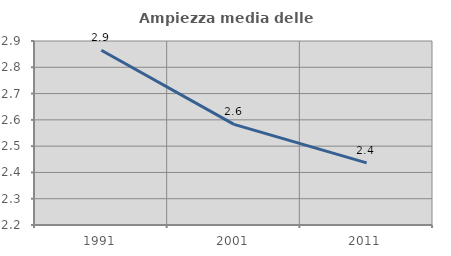
| Category | Ampiezza media delle famiglie |
|---|---|
| 1991.0 | 2.865 |
| 2001.0 | 2.583 |
| 2011.0 | 2.436 |